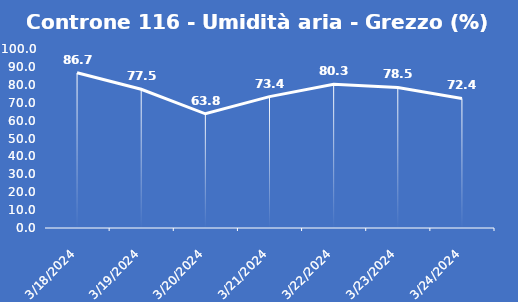
| Category | Controne 116 - Umidità aria - Grezzo (%) |
|---|---|
| 3/18/24 | 86.7 |
| 3/19/24 | 77.5 |
| 3/20/24 | 63.8 |
| 3/21/24 | 73.4 |
| 3/22/24 | 80.3 |
| 3/23/24 | 78.5 |
| 3/24/24 | 72.4 |